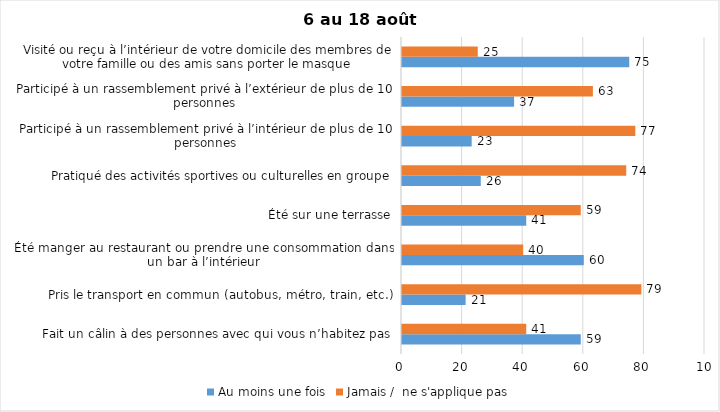
| Category | Au moins une fois | Jamais /  ne s'applique pas |
|---|---|---|
| Fait un câlin à des personnes avec qui vous n’habitez pas | 59 | 41 |
| Pris le transport en commun (autobus, métro, train, etc.) | 21 | 79 |
| Été manger au restaurant ou prendre une consommation dans un bar à l’intérieur | 60 | 40 |
| Été sur une terrasse | 41 | 59 |
| Pratiqué des activités sportives ou culturelles en groupe | 26 | 74 |
| Participé à un rassemblement privé à l’intérieur de plus de 10 personnes | 23 | 77 |
| Participé à un rassemblement privé à l’extérieur de plus de 10 personnes | 37 | 63 |
| Visité ou reçu à l’intérieur de votre domicile des membres de votre famille ou des amis sans porter le masque | 75 | 25 |